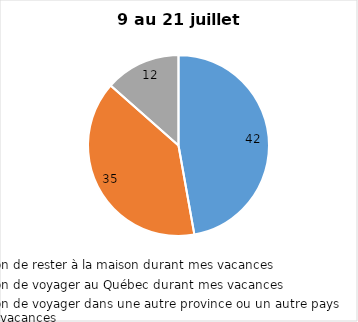
| Category | Series 0 |
|---|---|
| J’ai l’intention de rester à la maison durant mes vacances | 42 |
| J’ai l’intention de voyager au Québec durant mes vacances | 35 |
| J’ai l’intention de voyager dans une autre province ou un autre pays durant mes vacances | 12 |